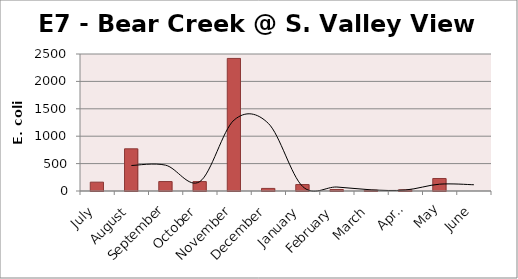
| Category | E. coli MPN |
|---|---|
| July | 161.6 |
| August | 770.1 |
| September | 172.6 |
| October | 172.2 |
| November | 2419.2 |
| December | 47.1 |
| January | 117.8 |
| February | 27.5 |
| March | 14.8 |
| April | 21.1 |
| May | 228.2 |
| June | 0 |